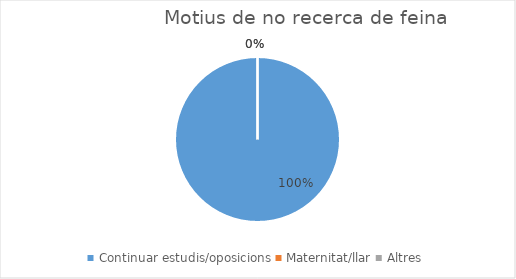
| Category | Series 0 |
|---|---|
| Continuar estudis/oposicions | 1 |
| Maternitat/llar | 0 |
| Altres | 0 |